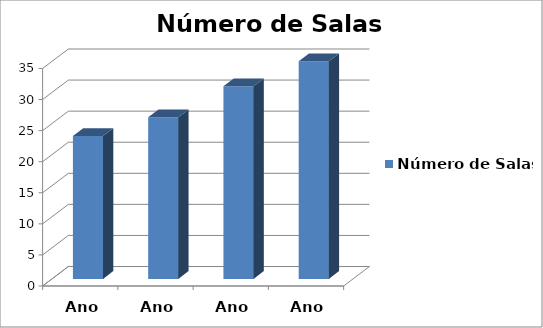
| Category | Número de Salas |
|---|---|
| Ano 2016 | 23 |
| Ano 2017 | 26 |
| Ano 2018 | 31 |
| Ano 2019 | 35 |